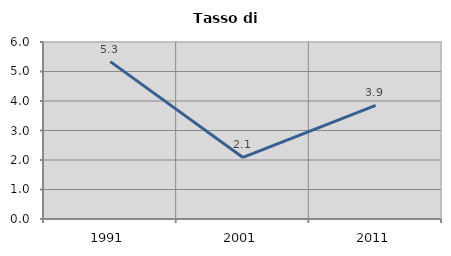
| Category | Tasso di disoccupazione   |
|---|---|
| 1991.0 | 5.334 |
| 2001.0 | 2.086 |
| 2011.0 | 3.853 |